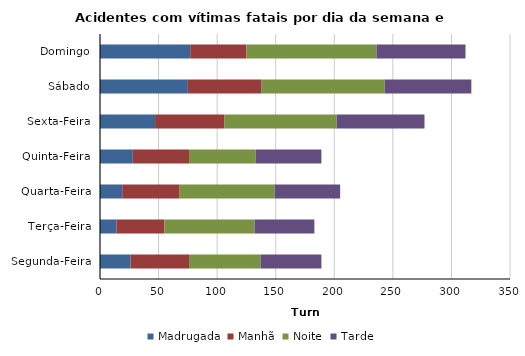
| Category | Madrugada | Manhã | Noite | Tarde |
|---|---|---|---|---|
| Segunda-Feira | 26 | 50 | 61 | 52 |
| Terça-Feira | 14 | 41 | 77 | 51 |
| Quarta-Feira | 19 | 49 | 81 | 56 |
| Quinta-Feira | 28 | 48 | 57 | 56 |
| Sexta-Feira | 47 | 59 | 96 | 75 |
| Sábado | 75 | 63 | 105 | 74 |
| Domingo | 77 | 48 | 111 | 76 |